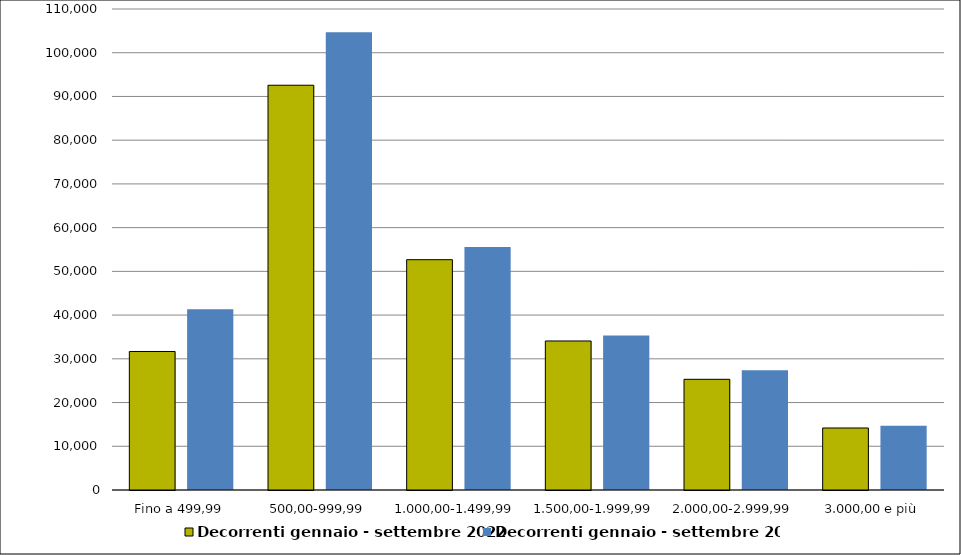
| Category | Decorrenti gennaio - settembre 2022 | Decorrenti gennaio - settembre 2021 |
|---|---|---|
| Fino a 499,99 | 31676 | 41345 |
| 500,00-999,99 | 92565 | 104709 |
| 1.000,00-1.499,99 | 52671 | 55590 |
| 1.500,00-1.999,99 | 34079 | 35334 |
| 2.000,00-2.999,99 | 25314 | 27361 |
| 3.000,00 e più | 14179 | 14693 |